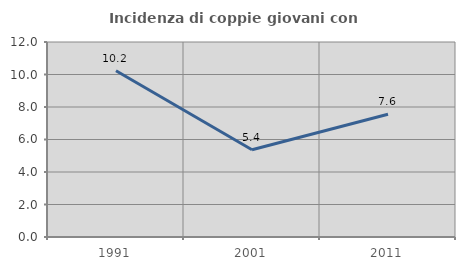
| Category | Incidenza di coppie giovani con figli |
|---|---|
| 1991.0 | 10.231 |
| 2001.0 | 5.369 |
| 2011.0 | 7.554 |